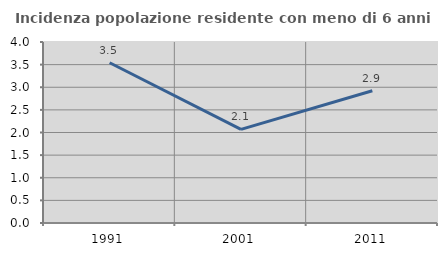
| Category | Incidenza popolazione residente con meno di 6 anni |
|---|---|
| 1991.0 | 3.542 |
| 2001.0 | 2.069 |
| 2011.0 | 2.923 |